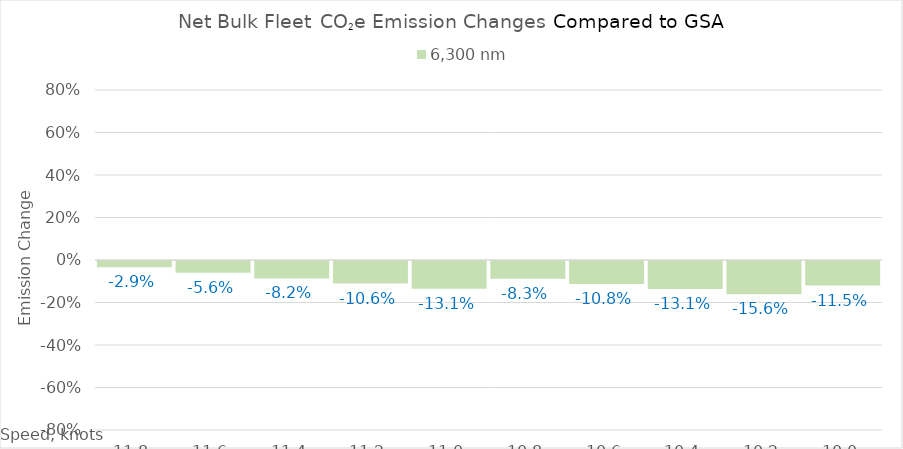
| Category | 6,300 |
|---|---|
| 11.8 | -0.029 |
| 11.600000000000001 | -0.056 |
| 11.400000000000002 | -0.082 |
| 11.200000000000003 | -0.106 |
| 11.000000000000004 | -0.131 |
| 10.800000000000004 | -0.083 |
| 10.600000000000005 | -0.108 |
| 10.400000000000006 | -0.131 |
| 10.200000000000006 | -0.156 |
| 10.000000000000007 | -0.115 |